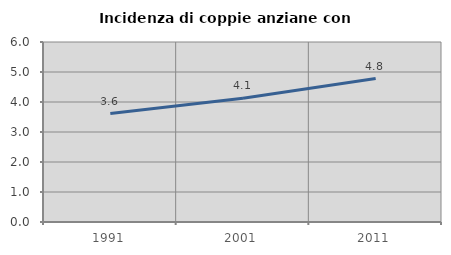
| Category | Incidenza di coppie anziane con figli |
|---|---|
| 1991.0 | 3.614 |
| 2001.0 | 4.126 |
| 2011.0 | 4.783 |